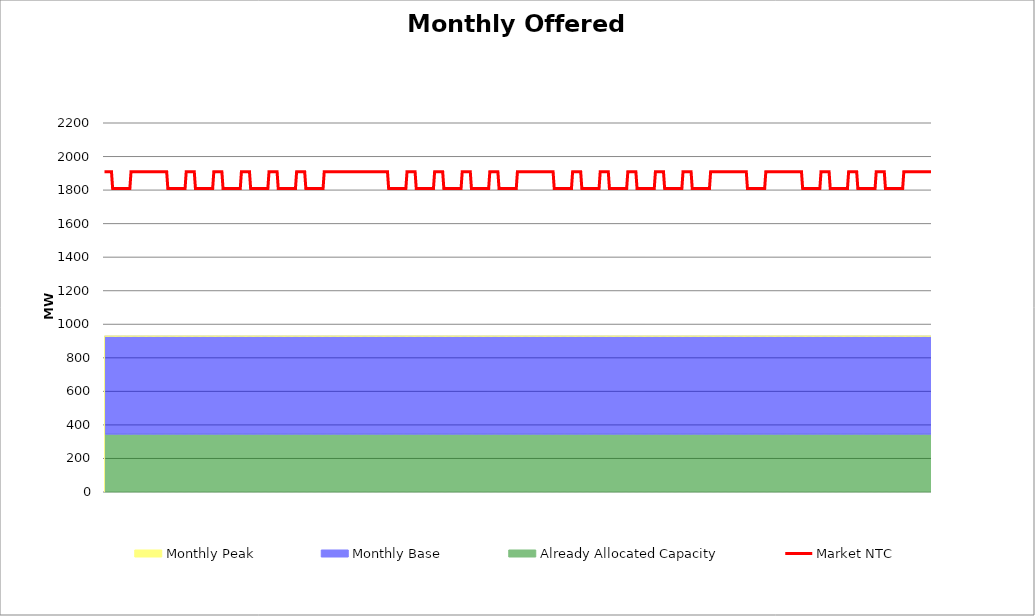
| Category | Market NTC |
|---|---|
| 0 | 1910 |
| 1 | 1910 |
| 2 | 1910 |
| 3 | 1910 |
| 4 | 1910 |
| 5 | 1910 |
| 6 | 1910 |
| 7 | 1810 |
| 8 | 1810 |
| 9 | 1810 |
| 10 | 1810 |
| 11 | 1810 |
| 12 | 1810 |
| 13 | 1810 |
| 14 | 1810 |
| 15 | 1810 |
| 16 | 1810 |
| 17 | 1810 |
| 18 | 1810 |
| 19 | 1810 |
| 20 | 1810 |
| 21 | 1810 |
| 22 | 1810 |
| 23 | 1910 |
| 24 | 1910 |
| 25 | 1910 |
| 26 | 1910 |
| 27 | 1910 |
| 28 | 1910 |
| 29 | 1910 |
| 30 | 1910 |
| 31 | 1910 |
| 32 | 1910 |
| 33 | 1910 |
| 34 | 1910 |
| 35 | 1910 |
| 36 | 1910 |
| 37 | 1910 |
| 38 | 1910 |
| 39 | 1910 |
| 40 | 1910 |
| 41 | 1910 |
| 42 | 1910 |
| 43 | 1910 |
| 44 | 1910 |
| 45 | 1910 |
| 46 | 1910 |
| 47 | 1910 |
| 48 | 1910 |
| 49 | 1910 |
| 50 | 1910 |
| 51 | 1910 |
| 52 | 1910 |
| 53 | 1910 |
| 54 | 1910 |
| 55 | 1810 |
| 56 | 1810 |
| 57 | 1810 |
| 58 | 1810 |
| 59 | 1810 |
| 60 | 1810 |
| 61 | 1810 |
| 62 | 1810 |
| 63 | 1810 |
| 64 | 1810 |
| 65 | 1810 |
| 66 | 1810 |
| 67 | 1810 |
| 68 | 1810 |
| 69 | 1810 |
| 70 | 1810 |
| 71 | 1910 |
| 72 | 1910 |
| 73 | 1910 |
| 74 | 1910 |
| 75 | 1910 |
| 76 | 1910 |
| 77 | 1910 |
| 78 | 1910 |
| 79 | 1810 |
| 80 | 1810 |
| 81 | 1810 |
| 82 | 1810 |
| 83 | 1810 |
| 84 | 1810 |
| 85 | 1810 |
| 86 | 1810 |
| 87 | 1810 |
| 88 | 1810 |
| 89 | 1810 |
| 90 | 1810 |
| 91 | 1810 |
| 92 | 1810 |
| 93 | 1810 |
| 94 | 1810 |
| 95 | 1910 |
| 96 | 1910 |
| 97 | 1910 |
| 98 | 1910 |
| 99 | 1910 |
| 100 | 1910 |
| 101 | 1910 |
| 102 | 1910 |
| 103 | 1810 |
| 104 | 1810 |
| 105 | 1810 |
| 106 | 1810 |
| 107 | 1810 |
| 108 | 1810 |
| 109 | 1810 |
| 110 | 1810 |
| 111 | 1810 |
| 112 | 1810 |
| 113 | 1810 |
| 114 | 1810 |
| 115 | 1810 |
| 116 | 1810 |
| 117 | 1810 |
| 118 | 1810 |
| 119 | 1910 |
| 120 | 1910 |
| 121 | 1910 |
| 122 | 1910 |
| 123 | 1910 |
| 124 | 1910 |
| 125 | 1910 |
| 126 | 1910 |
| 127 | 1810 |
| 128 | 1810 |
| 129 | 1810 |
| 130 | 1810 |
| 131 | 1810 |
| 132 | 1810 |
| 133 | 1810 |
| 134 | 1810 |
| 135 | 1810 |
| 136 | 1810 |
| 137 | 1810 |
| 138 | 1810 |
| 139 | 1810 |
| 140 | 1810 |
| 141 | 1810 |
| 142 | 1810 |
| 143 | 1910 |
| 144 | 1910 |
| 145 | 1910 |
| 146 | 1910 |
| 147 | 1910 |
| 148 | 1910 |
| 149 | 1910 |
| 150 | 1910 |
| 151 | 1810 |
| 152 | 1810 |
| 153 | 1810 |
| 154 | 1810 |
| 155 | 1810 |
| 156 | 1810 |
| 157 | 1810 |
| 158 | 1810 |
| 159 | 1810 |
| 160 | 1810 |
| 161 | 1810 |
| 162 | 1810 |
| 163 | 1810 |
| 164 | 1810 |
| 165 | 1810 |
| 166 | 1810 |
| 167 | 1910 |
| 168 | 1910 |
| 169 | 1910 |
| 170 | 1910 |
| 171 | 1910 |
| 172 | 1910 |
| 173 | 1910 |
| 174 | 1910 |
| 175 | 1810 |
| 176 | 1810 |
| 177 | 1810 |
| 178 | 1810 |
| 179 | 1810 |
| 180 | 1810 |
| 181 | 1810 |
| 182 | 1810 |
| 183 | 1810 |
| 184 | 1810 |
| 185 | 1810 |
| 186 | 1810 |
| 187 | 1810 |
| 188 | 1810 |
| 189 | 1810 |
| 190 | 1810 |
| 191 | 1910 |
| 192 | 1910 |
| 193 | 1910 |
| 194 | 1910 |
| 195 | 1910 |
| 196 | 1910 |
| 197 | 1910 |
| 198 | 1910 |
| 199 | 1910 |
| 200 | 1910 |
| 201 | 1910 |
| 202 | 1910 |
| 203 | 1910 |
| 204 | 1910 |
| 205 | 1910 |
| 206 | 1910 |
| 207 | 1910 |
| 208 | 1910 |
| 209 | 1910 |
| 210 | 1910 |
| 211 | 1910 |
| 212 | 1910 |
| 213 | 1910 |
| 214 | 1910 |
| 215 | 1910 |
| 216 | 1910 |
| 217 | 1910 |
| 218 | 1910 |
| 219 | 1910 |
| 220 | 1910 |
| 221 | 1910 |
| 222 | 1910 |
| 223 | 1910 |
| 224 | 1910 |
| 225 | 1910 |
| 226 | 1910 |
| 227 | 1910 |
| 228 | 1910 |
| 229 | 1910 |
| 230 | 1910 |
| 231 | 1910 |
| 232 | 1910 |
| 233 | 1910 |
| 234 | 1910 |
| 235 | 1910 |
| 236 | 1910 |
| 237 | 1910 |
| 238 | 1910 |
| 239 | 1910 |
| 240 | 1910 |
| 241 | 1910 |
| 242 | 1910 |
| 243 | 1910 |
| 244 | 1910 |
| 245 | 1910 |
| 246 | 1910 |
| 247 | 1810 |
| 248 | 1810 |
| 249 | 1810 |
| 250 | 1810 |
| 251 | 1810 |
| 252 | 1810 |
| 253 | 1810 |
| 254 | 1810 |
| 255 | 1810 |
| 256 | 1810 |
| 257 | 1810 |
| 258 | 1810 |
| 259 | 1810 |
| 260 | 1810 |
| 261 | 1810 |
| 262 | 1810 |
| 263 | 1910 |
| 264 | 1910 |
| 265 | 1910 |
| 266 | 1910 |
| 267 | 1910 |
| 268 | 1910 |
| 269 | 1910 |
| 270 | 1910 |
| 271 | 1810 |
| 272 | 1810 |
| 273 | 1810 |
| 274 | 1810 |
| 275 | 1810 |
| 276 | 1810 |
| 277 | 1810 |
| 278 | 1810 |
| 279 | 1810 |
| 280 | 1810 |
| 281 | 1810 |
| 282 | 1810 |
| 283 | 1810 |
| 284 | 1810 |
| 285 | 1810 |
| 286 | 1810 |
| 287 | 1910 |
| 288 | 1910 |
| 289 | 1910 |
| 290 | 1910 |
| 291 | 1910 |
| 292 | 1910 |
| 293 | 1910 |
| 294 | 1910 |
| 295 | 1810 |
| 296 | 1810 |
| 297 | 1810 |
| 298 | 1810 |
| 299 | 1810 |
| 300 | 1810 |
| 301 | 1810 |
| 302 | 1810 |
| 303 | 1810 |
| 304 | 1810 |
| 305 | 1810 |
| 306 | 1810 |
| 307 | 1810 |
| 308 | 1810 |
| 309 | 1810 |
| 310 | 1810 |
| 311 | 1910 |
| 312 | 1910 |
| 313 | 1910 |
| 314 | 1910 |
| 315 | 1910 |
| 316 | 1910 |
| 317 | 1910 |
| 318 | 1910 |
| 319 | 1810 |
| 320 | 1810 |
| 321 | 1810 |
| 322 | 1810 |
| 323 | 1810 |
| 324 | 1810 |
| 325 | 1810 |
| 326 | 1810 |
| 327 | 1810 |
| 328 | 1810 |
| 329 | 1810 |
| 330 | 1810 |
| 331 | 1810 |
| 332 | 1810 |
| 333 | 1810 |
| 334 | 1810 |
| 335 | 1910 |
| 336 | 1910 |
| 337 | 1910 |
| 338 | 1910 |
| 339 | 1910 |
| 340 | 1910 |
| 341 | 1910 |
| 342 | 1910 |
| 343 | 1810 |
| 344 | 1810 |
| 345 | 1810 |
| 346 | 1810 |
| 347 | 1810 |
| 348 | 1810 |
| 349 | 1810 |
| 350 | 1810 |
| 351 | 1810 |
| 352 | 1810 |
| 353 | 1810 |
| 354 | 1810 |
| 355 | 1810 |
| 356 | 1810 |
| 357 | 1810 |
| 358 | 1810 |
| 359 | 1910 |
| 360 | 1910 |
| 361 | 1910 |
| 362 | 1910 |
| 363 | 1910 |
| 364 | 1910 |
| 365 | 1910 |
| 366 | 1910 |
| 367 | 1910 |
| 368 | 1910 |
| 369 | 1910 |
| 370 | 1910 |
| 371 | 1910 |
| 372 | 1910 |
| 373 | 1910 |
| 374 | 1910 |
| 375 | 1910 |
| 376 | 1910 |
| 377 | 1910 |
| 378 | 1910 |
| 379 | 1910 |
| 380 | 1910 |
| 381 | 1910 |
| 382 | 1910 |
| 383 | 1910 |
| 384 | 1910 |
| 385 | 1910 |
| 386 | 1910 |
| 387 | 1910 |
| 388 | 1910 |
| 389 | 1910 |
| 390 | 1910 |
| 391 | 1810 |
| 392 | 1810 |
| 393 | 1810 |
| 394 | 1810 |
| 395 | 1810 |
| 396 | 1810 |
| 397 | 1810 |
| 398 | 1810 |
| 399 | 1810 |
| 400 | 1810 |
| 401 | 1810 |
| 402 | 1810 |
| 403 | 1810 |
| 404 | 1810 |
| 405 | 1810 |
| 406 | 1810 |
| 407 | 1910 |
| 408 | 1910 |
| 409 | 1910 |
| 410 | 1910 |
| 411 | 1910 |
| 412 | 1910 |
| 413 | 1910 |
| 414 | 1910 |
| 415 | 1810 |
| 416 | 1810 |
| 417 | 1810 |
| 418 | 1810 |
| 419 | 1810 |
| 420 | 1810 |
| 421 | 1810 |
| 422 | 1810 |
| 423 | 1810 |
| 424 | 1810 |
| 425 | 1810 |
| 426 | 1810 |
| 427 | 1810 |
| 428 | 1810 |
| 429 | 1810 |
| 430 | 1810 |
| 431 | 1910 |
| 432 | 1910 |
| 433 | 1910 |
| 434 | 1910 |
| 435 | 1910 |
| 436 | 1910 |
| 437 | 1910 |
| 438 | 1910 |
| 439 | 1810 |
| 440 | 1810 |
| 441 | 1810 |
| 442 | 1810 |
| 443 | 1810 |
| 444 | 1810 |
| 445 | 1810 |
| 446 | 1810 |
| 447 | 1810 |
| 448 | 1810 |
| 449 | 1810 |
| 450 | 1810 |
| 451 | 1810 |
| 452 | 1810 |
| 453 | 1810 |
| 454 | 1810 |
| 455 | 1910 |
| 456 | 1910 |
| 457 | 1910 |
| 458 | 1910 |
| 459 | 1910 |
| 460 | 1910 |
| 461 | 1910 |
| 462 | 1910 |
| 463 | 1810 |
| 464 | 1810 |
| 465 | 1810 |
| 466 | 1810 |
| 467 | 1810 |
| 468 | 1810 |
| 469 | 1810 |
| 470 | 1810 |
| 471 | 1810 |
| 472 | 1810 |
| 473 | 1810 |
| 474 | 1810 |
| 475 | 1810 |
| 476 | 1810 |
| 477 | 1810 |
| 478 | 1810 |
| 479 | 1910 |
| 480 | 1910 |
| 481 | 1910 |
| 482 | 1910 |
| 483 | 1910 |
| 484 | 1910 |
| 485 | 1910 |
| 486 | 1910 |
| 487 | 1810 |
| 488 | 1810 |
| 489 | 1810 |
| 490 | 1810 |
| 491 | 1810 |
| 492 | 1810 |
| 493 | 1810 |
| 494 | 1810 |
| 495 | 1810 |
| 496 | 1810 |
| 497 | 1810 |
| 498 | 1810 |
| 499 | 1810 |
| 500 | 1810 |
| 501 | 1810 |
| 502 | 1810 |
| 503 | 1910 |
| 504 | 1910 |
| 505 | 1910 |
| 506 | 1910 |
| 507 | 1910 |
| 508 | 1910 |
| 509 | 1910 |
| 510 | 1910 |
| 511 | 1810 |
| 512 | 1810 |
| 513 | 1810 |
| 514 | 1810 |
| 515 | 1810 |
| 516 | 1810 |
| 517 | 1810 |
| 518 | 1810 |
| 519 | 1810 |
| 520 | 1810 |
| 521 | 1810 |
| 522 | 1810 |
| 523 | 1810 |
| 524 | 1810 |
| 525 | 1810 |
| 526 | 1810 |
| 527 | 1910 |
| 528 | 1910 |
| 529 | 1910 |
| 530 | 1910 |
| 531 | 1910 |
| 532 | 1910 |
| 533 | 1910 |
| 534 | 1910 |
| 535 | 1910 |
| 536 | 1910 |
| 537 | 1910 |
| 538 | 1910 |
| 539 | 1910 |
| 540 | 1910 |
| 541 | 1910 |
| 542 | 1910 |
| 543 | 1910 |
| 544 | 1910 |
| 545 | 1910 |
| 546 | 1910 |
| 547 | 1910 |
| 548 | 1910 |
| 549 | 1910 |
| 550 | 1910 |
| 551 | 1910 |
| 552 | 1910 |
| 553 | 1910 |
| 554 | 1910 |
| 555 | 1910 |
| 556 | 1910 |
| 557 | 1910 |
| 558 | 1910 |
| 559 | 1810 |
| 560 | 1810 |
| 561 | 1810 |
| 562 | 1810 |
| 563 | 1810 |
| 564 | 1810 |
| 565 | 1810 |
| 566 | 1810 |
| 567 | 1810 |
| 568 | 1810 |
| 569 | 1810 |
| 570 | 1810 |
| 571 | 1810 |
| 572 | 1810 |
| 573 | 1810 |
| 574 | 1810 |
| 575 | 1910 |
| 576 | 1910 |
| 577 | 1910 |
| 578 | 1910 |
| 579 | 1910 |
| 580 | 1910 |
| 581 | 1910 |
| 582 | 1910 |
| 583 | 1910 |
| 584 | 1910 |
| 585 | 1910 |
| 586 | 1910 |
| 587 | 1910 |
| 588 | 1910 |
| 589 | 1910 |
| 590 | 1910 |
| 591 | 1910 |
| 592 | 1910 |
| 593 | 1910 |
| 594 | 1910 |
| 595 | 1910 |
| 596 | 1910 |
| 597 | 1910 |
| 598 | 1910 |
| 599 | 1910 |
| 600 | 1910 |
| 601 | 1910 |
| 602 | 1910 |
| 603 | 1910 |
| 604 | 1910 |
| 605 | 1910 |
| 606 | 1910 |
| 607 | 1810 |
| 608 | 1810 |
| 609 | 1810 |
| 610 | 1810 |
| 611 | 1810 |
| 612 | 1810 |
| 613 | 1810 |
| 614 | 1810 |
| 615 | 1810 |
| 616 | 1810 |
| 617 | 1810 |
| 618 | 1810 |
| 619 | 1810 |
| 620 | 1810 |
| 621 | 1810 |
| 622 | 1810 |
| 623 | 1910 |
| 624 | 1910 |
| 625 | 1910 |
| 626 | 1910 |
| 627 | 1910 |
| 628 | 1910 |
| 629 | 1910 |
| 630 | 1910 |
| 631 | 1810 |
| 632 | 1810 |
| 633 | 1810 |
| 634 | 1810 |
| 635 | 1810 |
| 636 | 1810 |
| 637 | 1810 |
| 638 | 1810 |
| 639 | 1810 |
| 640 | 1810 |
| 641 | 1810 |
| 642 | 1810 |
| 643 | 1810 |
| 644 | 1810 |
| 645 | 1810 |
| 646 | 1810 |
| 647 | 1910 |
| 648 | 1910 |
| 649 | 1910 |
| 650 | 1910 |
| 651 | 1910 |
| 652 | 1910 |
| 653 | 1910 |
| 654 | 1910 |
| 655 | 1810 |
| 656 | 1810 |
| 657 | 1810 |
| 658 | 1810 |
| 659 | 1810 |
| 660 | 1810 |
| 661 | 1810 |
| 662 | 1810 |
| 663 | 1810 |
| 664 | 1810 |
| 665 | 1810 |
| 666 | 1810 |
| 667 | 1810 |
| 668 | 1810 |
| 669 | 1810 |
| 670 | 1810 |
| 671 | 1910 |
| 672 | 1910 |
| 673 | 1910 |
| 674 | 1910 |
| 675 | 1910 |
| 676 | 1910 |
| 677 | 1910 |
| 678 | 1910 |
| 679 | 1810 |
| 680 | 1810 |
| 681 | 1810 |
| 682 | 1810 |
| 683 | 1810 |
| 684 | 1810 |
| 685 | 1810 |
| 686 | 1810 |
| 687 | 1810 |
| 688 | 1810 |
| 689 | 1810 |
| 690 | 1810 |
| 691 | 1810 |
| 692 | 1810 |
| 693 | 1810 |
| 694 | 1810 |
| 695 | 1910 |
| 696 | 1910 |
| 697 | 1910 |
| 698 | 1910 |
| 699 | 1910 |
| 700 | 1910 |
| 701 | 1910 |
| 702 | 1910 |
| 703 | 1910 |
| 704 | 1910 |
| 705 | 1910 |
| 706 | 1910 |
| 707 | 1910 |
| 708 | 1910 |
| 709 | 1910 |
| 710 | 1910 |
| 711 | 1910 |
| 712 | 1910 |
| 713 | 1910 |
| 714 | 1910 |
| 715 | 1910 |
| 716 | 1910 |
| 717 | 1910 |
| 718 | 1910 |
| 719 | 1910 |